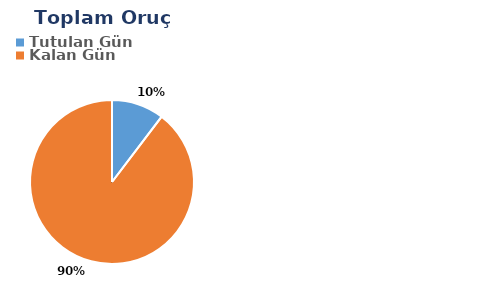
| Category | Toplam |
|---|---|
| Tutulan Gün | 3 |
| Kalan Gün | 26 |